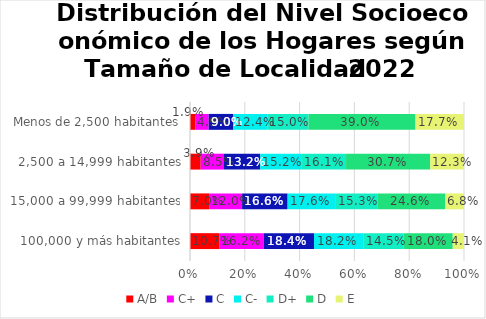
| Category | A/B | C+ | C | C- | D+ | D | E |
|---|---|---|---|---|---|---|---|
| 100,000 y más habitantes | 0.107 | 0.162 | 0.184 | 0.182 | 0.145 | 0.18 | 0.041 |
| 15,000 a 99,999 habitantes | 0.07 | 0.12 | 0.166 | 0.176 | 0.153 | 0.246 | 0.068 |
| 2,500 a 14,999 habitantes | 0.039 | 0.085 | 0.132 | 0.152 | 0.161 | 0.307 | 0.123 |
| Menos de 2,500 habitantes | 0.019 | 0.049 | 0.09 | 0.124 | 0.15 | 0.39 | 0.177 |